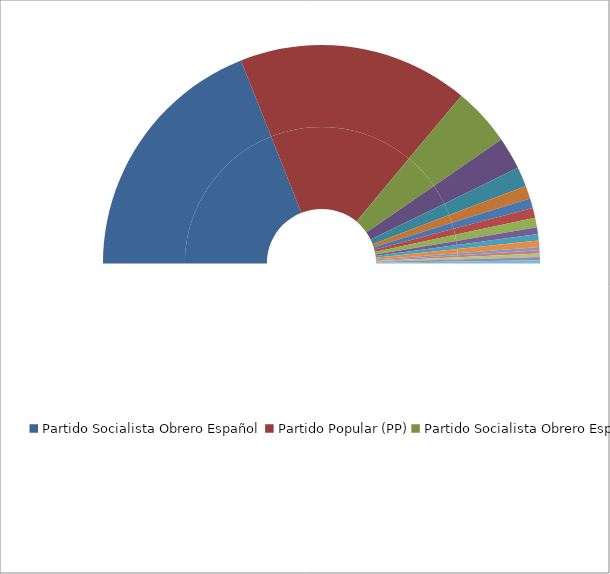
| Category | Series 0 | Series 1 |
|---|---|---|
| Partido Socialista Obrero Español | 79 | 37.981 |
| Partido Popular (PP) | 71 | 34.135 |
| Partido Socialista Obrero Español de Andalucía | 18 | 8.654 |
| Convergencia i Unió (CiU) | 10 | 4.808 |
| Partit dels Socialistes de Catalunya (PSC-PSOE) | 6 | 2.885 |
| Eusko Alderdi Jetzalea - Partido Nacionalista Vasco (EAJ - PNV) | 4 | 1.923 |
| Herri Batasuna | 3 | 1.442 |
| Unión del Pueblo Navarro - Coalición PP (UPN-PP) | 3 | 1.442 |
| PP - Coalición Centristas de Galicia (PP-CG) | 3 | 1.442 |
| Partido Socialista de Galicia (PSG-PSOE) | 2 | 0.962 |
| Partido Socialista de Euskadi-PSOE | 2 | 0.962 |
| Centro Democrático y Social | 2 | 0.962 |
| Agrupaciones Independientes de Canarias | 1 | 0.481 |
| Izquierda Unida - Convocatoria por Andalucía | 1 | 0.481 |
| Asamblea Majorera | 1 | 0.481 |
| Independiente de Lanzarote | 1 | 0.481 |
| Agrupación Herreña Independiente | 1 | 0.481 |